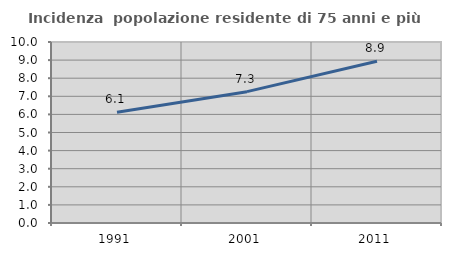
| Category | Incidenza  popolazione residente di 75 anni e più |
|---|---|
| 1991.0 | 6.122 |
| 2001.0 | 7.257 |
| 2011.0 | 8.932 |